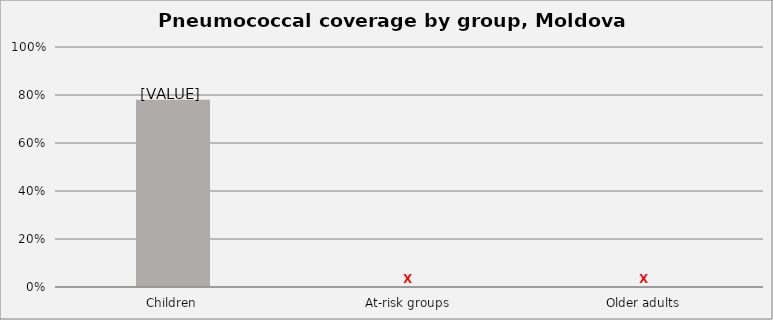
| Category | Series 0 |
|---|---|
| Children | 0.78 |
| At-risk groups | 0 |
| Older adults | 0 |